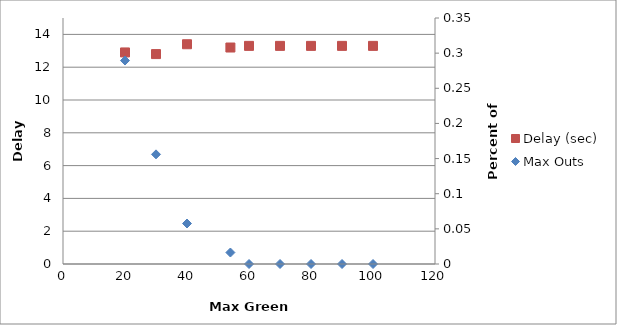
| Category | Delay (sec) |
|---|---|
| 100.0 | 13.3 |
| 90.0 | 13.3 |
| 80.0 | 13.3 |
| 70.0 | 13.3 |
| 60.0 | 13.3 |
| 54.0 | 13.2 |
| 40.0 | 13.4 |
| 30.0 | 12.8 |
| 20.0 | 12.9 |